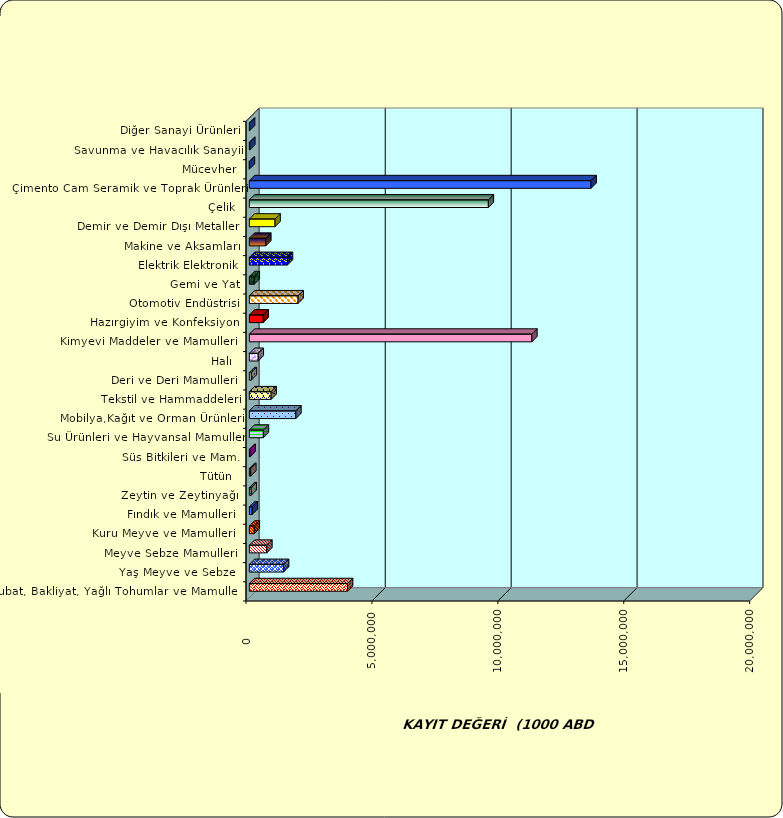
| Category | Series 0 |
|---|---|
|  Hububat, Bakliyat, Yağlı Tohumlar ve Mamulleri  | 3900246.276 |
|  Yaş Meyve ve Sebze   | 1359580.113 |
|  Meyve Sebze Mamulleri  | 694516.741 |
|  Kuru Meyve ve Mamulleri   | 195385.657 |
|  Fındık ve Mamulleri  | 115432.768 |
|  Zeytin ve Zeytinyağı  | 72587.963 |
|  Tütün  | 57446.51 |
|  Süs Bitkileri ve Mam. | 27849.304 |
|  Su Ürünleri ve Hayvansal Mamuller | 556968.084 |
|  Mobilya,Kağıt ve Orman Ürünleri | 1847520.231 |
|  Tekstil ve Hammaddeleri | 865524.681 |
|  Deri ve Deri Mamulleri  | 77236.914 |
|  Halı  | 353188.326 |
|  Kimyevi Maddeler ve Mamulleri   | 11218545.684 |
|  Hazırgiyim ve Konfeksiyon  | 550717.442 |
|  Otomotiv Endüstrisi | 1935546.277 |
|  Gemi ve Yat | 195354.269 |
|  Elektrik Elektronik | 1512430.108 |
|  Makine ve Aksamları | 652693.744 |
|  Demir ve Demir Dışı Metaller  | 1020453.923 |
|  Çelik | 9490752.19 |
|  Çimento Cam Seramik ve Toprak Ürünleri | 13569746.576 |
|  Mücevher | 2722.417 |
|  Savunma ve Havacılık Sanayii | 16890.167 |
|  Diğer Sanayi Ürünleri | 8081.943 |